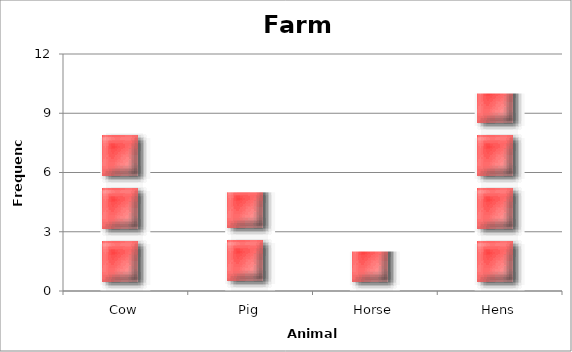
| Category | Farm Animals |
|---|---|
| Cow | 8 |
| Pig | 5 |
| Horse | 2 |
| Hens | 10 |